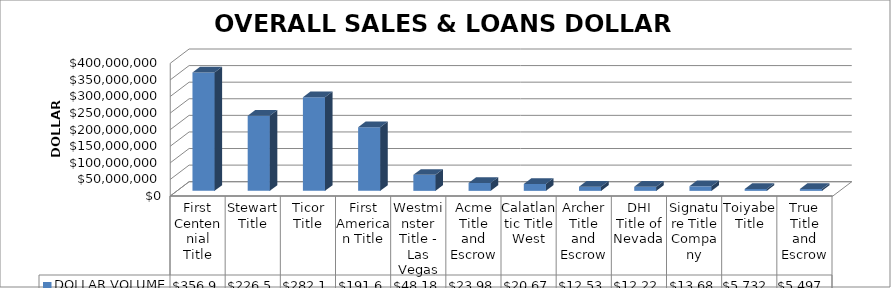
| Category | DOLLAR VOLUME |
|---|---|
| First Centennial Title | 356935164 |
| Stewart Title | 226521261.69 |
| Ticor Title | 282196311.08 |
| First American Title | 191628049.74 |
| Westminster Title - Las Vegas | 48180148 |
| Acme Title and Escrow | 23984793 |
| Calatlantic Title West | 20676024 |
| Archer Title and Escrow | 12538190 |
| DHI Title of Nevada | 12228179 |
| Signature Title Company | 13680301 |
| Toiyabe Title | 5732316 |
| True Title and Escrow | 5497800 |